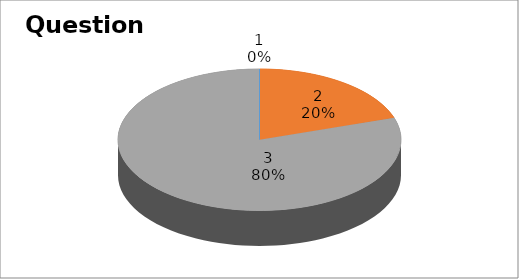
| Category | Series 0 |
|---|---|
| 0 | 0 |
| 1 | 2 |
| 2 | 8 |